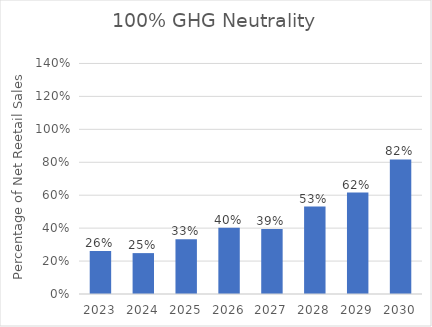
| Category | Percentage Clean Energy |
|---|---|
| 2023.0 | 0.262 |
| 2024.0 | 0.248 |
| 2025.0 | 0.333 |
| 2026.0 | 0.403 |
| 2027.0 | 0.394 |
| 2028.0 | 0.531 |
| 2029.0 | 0.616 |
| 2030.0 | 0.817 |